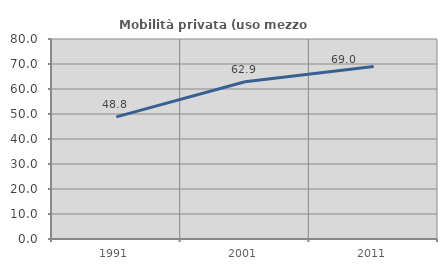
| Category | Mobilità privata (uso mezzo privato) |
|---|---|
| 1991.0 | 48.841 |
| 2001.0 | 62.914 |
| 2011.0 | 68.996 |